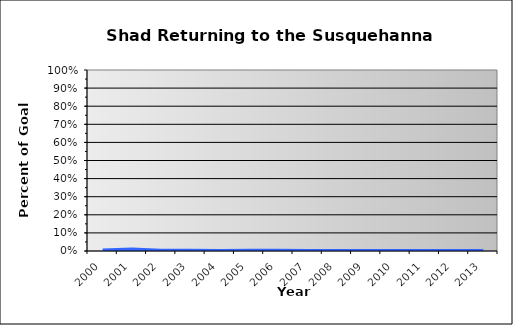
| Category | York Haven Percent Achieved |
|---|---|
| 2000.0 | 0.002 |
| 2001.0 | 0.008 |
| 2002.0 | 0.001 |
| 2003.0 | 0.001 |
| 2004.0 | 0 |
| 2005.0 | 0.001 |
| 2006.0 | 0.001 |
| 2007.0 | 0 |
| 2008.0 | 0 |
| 2009.0 | 0 |
| 2010.0 | 0 |
| 2011.0 | 0 |
| 2012.0 | 0 |
| 2013.0 | 0 |